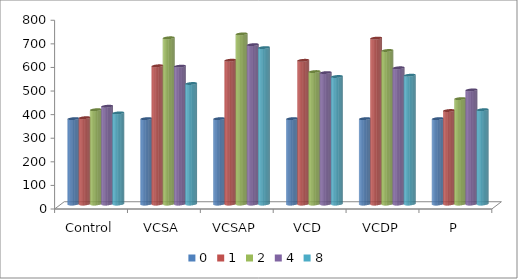
| Category | 0 | 1 | 2 | 4 | 8 |
|---|---|---|---|---|---|
| Control | 361.82 | 365.8 | 399.7 | 414.4 | 386.3 |
| VCSA | 361.82 | 585.8 | 704.5 | 584.2 | 510.7 |
| VCSAP | 361.82 | 609.5 | 721 | 675.4 | 663 |
| VCD | 361.82 | 609.1 | 561.3 | 557 | 540.4 |
| VCDP | 361.82 | 703.1 | 650.6 | 577.4 | 546 |
| P | 361.82 | 396.2 | 446.8 | 483.6 | 399.7 |